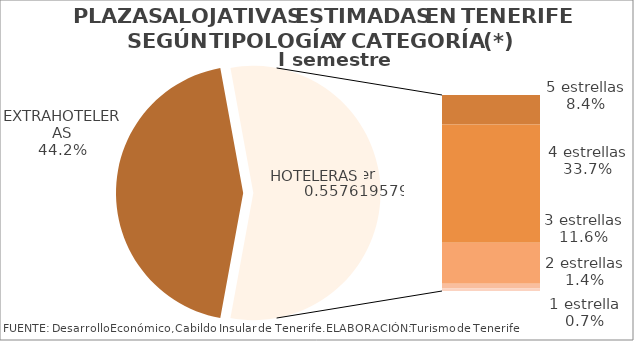
| Category | I semestre 2014 |
|---|---|
| EXTRAHOTELERAS | 0.442 |
| 5 estrellas | 0.084 |
| 4 estrellas | 0.337 |
| 3 estrellas | 0.116 |
| 2 estrellas | 0.014 |
| 1 estrella | 0.007 |